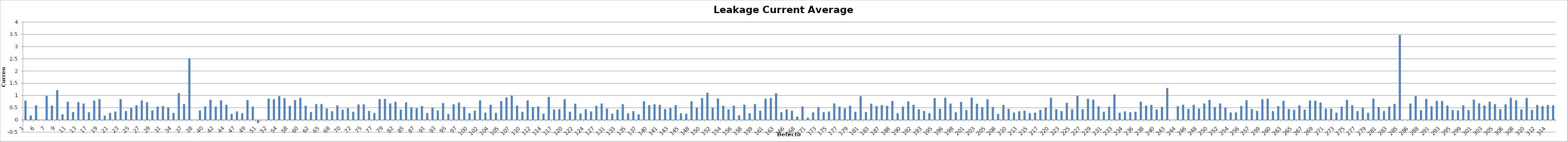
| Category | Leakage Current Average [pA] |
|---|---|
| 1.0 | 0.792 |
| 4.0 | 0.182 |
| 6.0 | 0.598 |
| 6.0 | 0 |
| 7.0 | 0.98 |
| 8.0 | 0.59 |
| 9.0 | 1.218 |
| 10.0 | 0.23 |
| 11.0 | 0.748 |
| 12.0 | 0.322 |
| 13.0 | 0.73 |
| 14.0 | 0.668 |
| 17.0 | 0.316 |
| 18.0 | 0.796 |
| 19.0 | 0.85 |
| 20.0 | 0.178 |
| 21.0 | 0.286 |
| 22.0 | 0.344 |
| 23.0 | 0.852 |
| 24.0 | 0.364 |
| 25.0 | 0.496 |
| 26.0 | 0.602 |
| 27.0 | 0.796 |
| 28.0 | 0.722 |
| 29.0 | 0.392 |
| 30.0 | 0.546 |
| 31.0 | 0.566 |
| 32.0 | 0.518 |
| 34.0 | 0.288 |
| 36.0 | 1.094 |
| 37.0 | 0.646 |
| 38.0 | 2.52 |
| 38.0 | 0 |
| 39.0 | 0.388 |
| 40.0 | 0.552 |
| 41.0 | 0.824 |
| 42.0 | 0.544 |
| 43.0 | 0.8 |
| 44.0 | 0.624 |
| 45.0 | 0.248 |
| 47.0 | 0.35 |
| 48.0 | 0.274 |
| 49.0 | 0.812 |
| 50.0 | 0.544 |
| 51.0 | -0.112 |
| 51.0 | 0 |
| 52.0 | 0.876 |
| 53.0 | 0.852 |
| 54.0 | 0.974 |
| 57.0 | 0.89 |
| 58.0 | 0.578 |
| 59.0 | 0.81 |
| 60.0 | 0.902 |
| 61.0 | 0.582 |
| 62.0 | 0.324 |
| 64.0 | 0.648 |
| 65.0 | 0.65 |
| 66.0 | 0.466 |
| 68.0 | 0.356 |
| 69.0 | 0.598 |
| 70.0 | 0.42 |
| 71.0 | 0.48 |
| 72.0 | 0.334 |
| 74.0 | 0.632 |
| 75.0 | 0.636 |
| 76.0 | 0.368 |
| 77.0 | 0.284 |
| 78.0 | 0.854 |
| 79.0 | 0.858 |
| 81.0 | 0.672 |
| 82.0 | 0.74 |
| 83.0 | 0.426 |
| 85.0 | 0.722 |
| 86.0 | 0.518 |
| 87.0 | 0.482 |
| 88.0 | 0.568 |
| 91.0 | 0.282 |
| 92.0 | 0.504 |
| 93.0 | 0.388 |
| 94.0 | 0.69 |
| 95.0 | 0.24 |
| 96.0 | 0.64 |
| 97.0 | 0.712 |
| 99.0 | 0.534 |
| 100.0 | 0.278 |
| 101.0 | 0.378 |
| 102.0 | 0.8 |
| 103.0 | 0.3 |
| 104.0 | 0.624 |
| 105.0 | 0.292 |
| 105.0 | 0.772 |
| 106.0 | 0.924 |
| 107.0 | 0.992 |
| 108.0 | 0.59 |
| 110.0 | 0.33 |
| 111.0 | 0.8 |
| 112.0 | 0.528 |
| 113.0 | 0.552 |
| 114.0 | 0.256 |
| 116.0 | 0.936 |
| 117.0 | 0.428 |
| 118.0 | 0.44 |
| 120.0 | 0.85 |
| 121.0 | 0.336 |
| 122.0 | 0.664 |
| 123.0 | 0.264 |
| 124.0 | 0.436 |
| 126.0 | 0.35 |
| 127.0 | 0.578 |
| 130.0 | 0.67 |
| 131.0 | 0.466 |
| 132.0 | 0.252 |
| 133.0 | 0.422 |
| 134.0 | 0.642 |
| 135.0 | 0.272 |
| 136.0 | 0.362 |
| 137.0 | 0.23 |
| 138.0 | 0.762 |
| 140.0 | 0.606 |
| 141.0 | 0.642 |
| 141.0 | 0.618 |
| 142.0 | 0.446 |
| 143.0 | 0.486 |
| 144.0 | 0.602 |
| 145.0 | 0.274 |
| 147.0 | 0.254 |
| 148.0 | 0.764 |
| 149.0 | 0.506 |
| 150.0 | 0.894 |
| 151.0 | 1.11 |
| 152.0 | 0.508 |
| 153.0 | 0.878 |
| 154.0 | 0.582 |
| 155.0 | 0.43 |
| 156.0 | 0.584 |
| 157.0 | 0.19 |
| 158.0 | 0.626 |
| 159.0 | 0.274 |
| 159.0 | 0.65 |
| 160.0 | 0.378 |
| 161.0 | 0.866 |
| 162.0 | 0.9 |
| 163.0 | 1.09 |
| 165.0 | 0.316 |
| 166.0 | 0.43 |
| 167.0 | 0.378 |
| 168.0 | 0.138 |
| 170.0 | 0.546 |
| 171.0 | 0.094 |
| 172.0 | 0.312 |
| 173.0 | 0.524 |
| 174.0 | 0.318 |
| 175.0 | 0.346 |
| 176.0 | 0.672 |
| 177.0 | 0.542 |
| 178.0 | 0.472 |
| 179.0 | 0.582 |
| 180.0 | 0.336 |
| 181.0 | 0.97 |
| 182.0 | 0.326 |
| 183.0 | 0.664 |
| 184.0 | 0.572 |
| 187.0 | 0.606 |
| 187.0 | 0.572 |
| 188.0 | 0.776 |
| 189.0 | 0.274 |
| 190.0 | 0.544 |
| 191.0 | 0.762 |
| 192.0 | 0.62 |
| 192.0 | 0.432 |
| 193.0 | 0.368 |
| 194.0 | 0.274 |
| 195.0 | 0.894 |
| 196.0 | 0.458 |
| 196.0 | 0.91 |
| 197.0 | 0.668 |
| 198.0 | 0.314 |
| 200.0 | 0.736 |
| 201.0 | 0.406 |
| 202.0 | 0.912 |
| 203.0 | 0.66 |
| 204.0 | 0.524 |
| 205.0 | 0.846 |
| 207.0 | 0.53 |
| 208.0 | 0.248 |
| 209.0 | 0.616 |
| 210.0 | 0.454 |
| 212.0 | 0.302 |
| 213.0 | 0.358 |
| 214.0 | 0.378 |
| 215.0 | 0.276 |
| 216.0 | 0.3 |
| 217.0 | 0.406 |
| 219.0 | 0.51 |
| 220.0 | 0.908 |
| 222.0 | 0.436 |
| 223.0 | 0.362 |
| 224.0 | 0.7 |
| 225.0 | 0.438 |
| 226.0 | 0.986 |
| 227.0 | 0.438 |
| 228.0 | 0.864 |
| 229.0 | 0.83 |
| 230.0 | 0.556 |
| 231.0 | 0.338 |
| 232.0 | 0.542 |
| 233.0 | 1.044 |
| 233.0 | 0.296 |
| 234.0 | 0.35 |
| 235.0 | 0.316 |
| 236.0 | 0.338 |
| 237.0 | 0.746 |
| 238.0 | 0.588 |
| 239.0 | 0.618 |
| 240.0 | 0.426 |
| 241.0 | 0.534 |
| 243.0 | 1.304 |
| 243.0 | 0 |
| 244.0 | 0.562 |
| 245.0 | 0.62 |
| 246.0 | 0.448 |
| 247.0 | 0.616 |
| 248.0 | 0.466 |
| 249.0 | 0.672 |
| 250.0 | 0.822 |
| 251.0 | 0.528 |
| 252.0 | 0.674 |
| 253.0 | 0.508 |
| 254.0 | 0.308 |
| 255.0 | 0.308 |
| 256.0 | 0.574 |
| 256.0 | 0.808 |
| 257.0 | 0.444 |
| 258.0 | 0.372 |
| 259.0 | 0.846 |
| 260.0 | 0.864 |
| 260.0 | 0.362 |
| 261.0 | 0.564 |
| 263.0 | 0.782 |
| 264.0 | 0.446 |
| 265.0 | 0.414 |
| 266.0 | 0.598 |
| 267.0 | 0.422 |
| 268.0 | 0.796 |
| 269.0 | 0.79 |
| 270.0 | 0.71 |
| 271.0 | 0.462 |
| 272.0 | 0.458 |
| 273.0 | 0.298 |
| 274.0 | 0.542 |
| 275.0 | 0.82 |
| 276.0 | 0.602 |
| 277.0 | 0.362 |
| 278.0 | 0.508 |
| 279.0 | 0.294 |
| 280.0 | 0.87 |
| 281.0 | 0.526 |
| 282.0 | 0.364 |
| 283.0 | 0.546 |
| 284.0 | 0.656 |
| 285.0 | 3.474 |
| 285.0 | 0 |
| 286.0 | 0.668 |
| 287.0 | 0.98 |
| 288.0 | 0.396 |
| 289.0 | 0.858 |
| 291.0 | 0.56 |
| 292.0 | 0.778 |
| 293.0 | 0.778 |
| 294.0 | 0.592 |
| 295.0 | 0.402 |
| 297.0 | 0.388 |
| 299.0 | 0.598 |
| 300.0 | 0.406 |
| 301.0 | 0.832 |
| 302.0 | 0.68 |
| 303.0 | 0.594 |
| 304.0 | 0.748 |
| 305.0 | 0.646 |
| 306.0 | 0.44 |
| 306.0 | 0.636 |
| 307.0 | 0.906 |
| 308.0 | 0.8 |
| 309.0 | 0.43 |
| 310.0 | 0.898 |
| 311.0 | 0.408 |
| 312.0 | 0.612 |
| 313.0 | 0.566 |
| 314.0 | 0.61 |
| 315.0 | 0.598 |